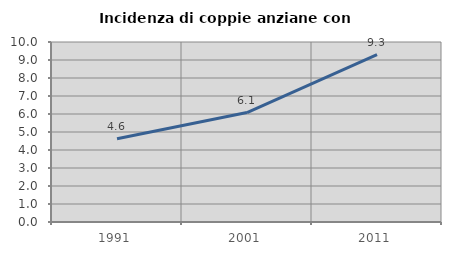
| Category | Incidenza di coppie anziane con figli |
|---|---|
| 1991.0 | 4.624 |
| 2001.0 | 6.081 |
| 2011.0 | 9.302 |